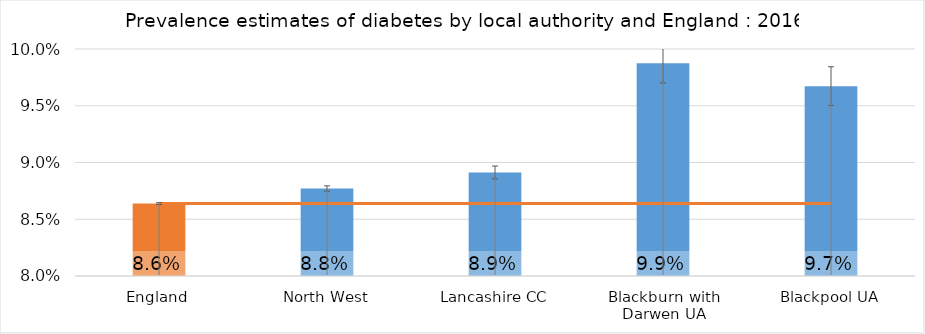
| Category | Series 0 |
|---|---|
| England | 0.086 |
| North West | 0.088 |
| Lancashire CC | 0.089 |
| Blackburn with Darwen UA | 0.099 |
| Blackpool UA | 0.097 |